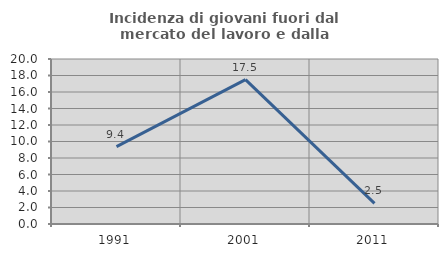
| Category | Incidenza di giovani fuori dal mercato del lavoro e dalla formazione  |
|---|---|
| 1991.0 | 9.375 |
| 2001.0 | 17.5 |
| 2011.0 | 2.5 |